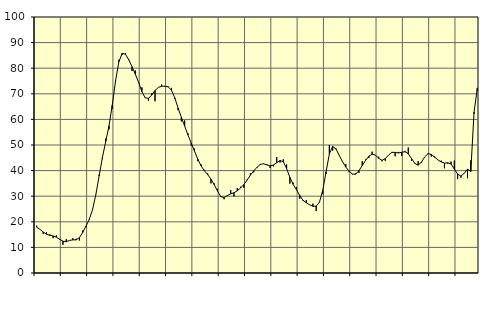
| Category | Piggar | Series 1 |
|---|---|---|
| nan | 18.5 | 17.9 |
| 87.0 | 17.1 | 17.07 |
| 87.0 | 15.2 | 16.02 |
| 87.0 | 15.9 | 15.16 |
| nan | 15.1 | 14.74 |
| 88.0 | 13.6 | 14.48 |
| 88.0 | 14.7 | 14 |
| 88.0 | 13 | 13.2 |
| nan | 11 | 12.41 |
| 89.0 | 13.2 | 12.24 |
| 89.0 | 12.7 | 12.73 |
| 89.0 | 13.6 | 12.94 |
| nan | 13.4 | 12.93 |
| 90.0 | 12.7 | 13.82 |
| 90.0 | 16.6 | 15.82 |
| 90.0 | 17.9 | 18.33 |
| nan | 21.2 | 20.95 |
| 91.0 | 24.6 | 24.78 |
| 91.0 | 30.7 | 30.62 |
| 91.0 | 38.4 | 37.9 |
| nan | 44.7 | 45.17 |
| 92.0 | 52.5 | 51.31 |
| 92.0 | 56.1 | 57.49 |
| 92.0 | 64.1 | 65.64 |
| nan | 75.3 | 75.07 |
| 93.0 | 83.3 | 82.49 |
| 93.0 | 85.2 | 85.81 |
| 93.0 | 85.9 | 85.46 |
| nan | 83.6 | 83.3 |
| 94.0 | 78.9 | 80.58 |
| 94.0 | 79.1 | 77.7 |
| 94.0 | 74.3 | 74.43 |
| nan | 72.5 | 70.84 |
| 95.0 | 68.6 | 68.44 |
| 95.0 | 67.3 | 68.19 |
| 95.0 | 70.2 | 69.52 |
| nan | 67.1 | 71.3 |
| 96.0 | 72.5 | 72.5 |
| 96.0 | 73.6 | 72.93 |
| 96.0 | 72.8 | 72.99 |
| nan | 72.9 | 72.68 |
| 97.0 | 72.3 | 71.45 |
| 97.0 | 68 | 68.41 |
| 97.0 | 63.6 | 64.45 |
| nan | 59.2 | 60.84 |
| 98.0 | 59.6 | 57.4 |
| 98.0 | 54.6 | 53.92 |
| 98.0 | 49.7 | 50.76 |
| nan | 48.6 | 47.58 |
| 99.0 | 43.7 | 44.48 |
| 99.0 | 42.4 | 41.83 |
| 99.0 | 40.3 | 39.93 |
| nan | 38.9 | 38.46 |
| 0.0 | 35 | 36.65 |
| 0.0 | 35 | 34.51 |
| 0.0 | 32.9 | 31.99 |
| nan | 29.7 | 29.83 |
| 1.0 | 28.8 | 29.45 |
| 1.0 | 30 | 30.26 |
| 1.0 | 32.4 | 30.92 |
| nan | 29.9 | 31.35 |
| 2.0 | 33.2 | 32.09 |
| 2.0 | 33.7 | 33.19 |
| 2.0 | 33.3 | 34.56 |
| nan | 36.5 | 36.28 |
| 3.0 | 39 | 38.24 |
| 3.0 | 39.3 | 39.9 |
| 3.0 | 41.1 | 41.29 |
| nan | 42.6 | 42.4 |
| 4.0 | 42.6 | 42.67 |
| 4.0 | 42.5 | 42.22 |
| 4.0 | 41 | 41.86 |
| nan | 41.6 | 42.21 |
| 5.0 | 45.3 | 43.07 |
| 5.0 | 43.1 | 43.94 |
| 5.0 | 44.4 | 43.48 |
| nan | 42.4 | 40.83 |
| 6.0 | 34.9 | 37.36 |
| 6.0 | 35.3 | 34.61 |
| 6.0 | 33.6 | 32.54 |
| nan | 29 | 30.3 |
| 7.0 | 28.1 | 28.4 |
| 7.0 | 28.5 | 27.44 |
| 7.0 | 26.6 | 26.66 |
| nan | 27.1 | 26.05 |
| 8.0 | 24.2 | 26.13 |
| 8.0 | 27.7 | 27.72 |
| 8.0 | 30.8 | 32.32 |
| nan | 38.8 | 39.52 |
| 9.0 | 50 | 46.51 |
| 9.0 | 47.8 | 49.43 |
| 9.0 | 48.7 | 48.46 |
| nan | 45.9 | 45.98 |
| 10.0 | 43.7 | 43.47 |
| 10.0 | 42.5 | 41.37 |
| 10.0 | 39.4 | 39.8 |
| nan | 38.5 | 38.65 |
| 11.0 | 38.9 | 38.6 |
| 11.0 | 39.1 | 39.99 |
| 11.0 | 43.7 | 41.96 |
| nan | 44.3 | 43.97 |
| 12.0 | 44.9 | 45.66 |
| 12.0 | 47.4 | 46.39 |
| 12.0 | 46.1 | 46.05 |
| nan | 45.4 | 44.8 |
| 13.0 | 43.6 | 44 |
| 13.0 | 43.8 | 44.66 |
| 13.0 | 46.1 | 46.06 |
| nan | 47.3 | 47.12 |
| 14.0 | 45.6 | 47.12 |
| 14.0 | 47.3 | 46.88 |
| 14.0 | 45.8 | 47.17 |
| nan | 47.7 | 47.38 |
| 15.0 | 49 | 46.59 |
| 15.0 | 43.8 | 44.71 |
| 15.0 | 42.9 | 42.78 |
| nan | 43.7 | 42.12 |
| 16.0 | 43.1 | 43.32 |
| 16.0 | 45.3 | 45.34 |
| 16.0 | 46.8 | 46.62 |
| nan | 45.5 | 46.32 |
| 17.0 | 45.6 | 45.23 |
| 17.0 | 44.2 | 44.2 |
| 17.0 | 43.9 | 43.39 |
| nan | 40.9 | 42.92 |
| 18.0 | 42.7 | 43.05 |
| 18.0 | 43.5 | 42.57 |
| 18.0 | 43.9 | 40.62 |
| nan | 36.7 | 38.64 |
| 19.0 | 37.2 | 37.85 |
| 19.0 | 39 | 38.92 |
| 19.0 | 37 | 40.56 |
| nan | 44 | 39.66 |
| 20.0 | 62.2 | 62.85 |
| 20.0 | 71.1 | 72.31 |